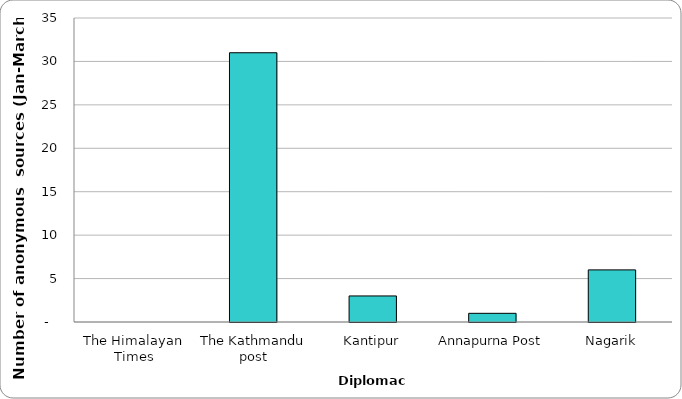
| Category | Diplomacy |
|---|---|
| The Himalayan Times | 0 |
| The Kathmandu post | 31 |
| Kantipur | 3 |
| Annapurna Post | 1 |
| Nagarik | 6 |